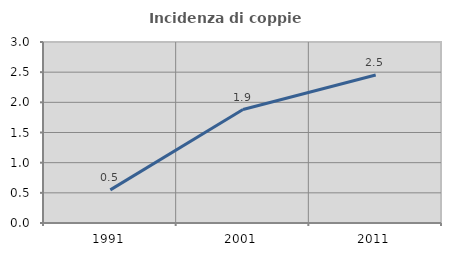
| Category | Incidenza di coppie miste |
|---|---|
| 1991.0 | 0.549 |
| 2001.0 | 1.881 |
| 2011.0 | 2.453 |